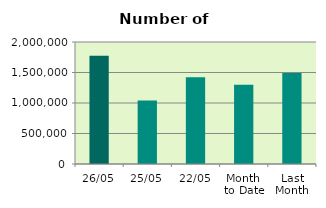
| Category | Series 0 |
|---|---|
| 26/05 | 1775562 |
| 25/05 | 1041888 |
| 22/05 | 1420532 |
| Month 
to Date | 1297646.706 |
| Last
Month | 1493476.8 |